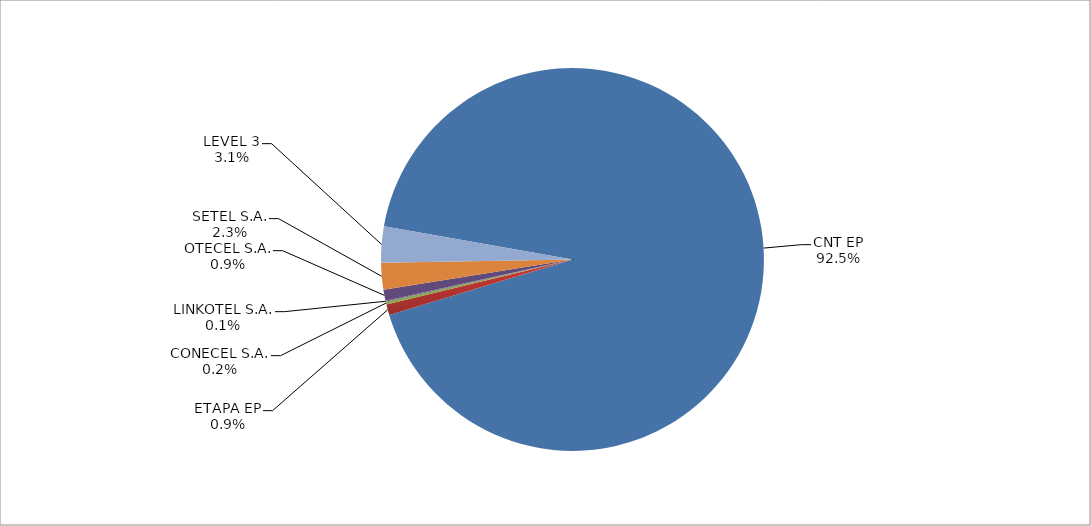
| Category | Series 0 |
|---|---|
| CNT EP | 2669 |
| ETAPA EP | 26 |
| CONECEL S.A. | 7 |
| LINKOTEL S.A. | 2 |
| OTECEL S.A. | 27 |
| SETEL S.A. | 65 |
| LEVEL 3 | 88 |